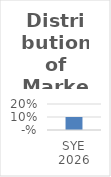
| Category | Series 0 |
|---|---|
| 2026.0 | 0.1 |